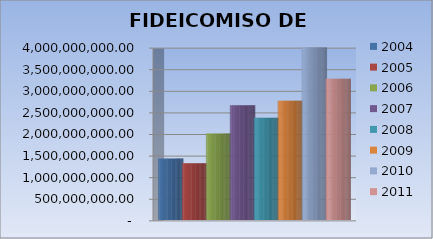
| Category | 2004 | 2005 | 2006 | 2007 | 2008 | 2009 | 2010 | 2011 |
|---|---|---|---|---|---|---|---|---|
| 0 | 1422260632.71 | 1313515937.59 | 2001466460.07 | 2656443950.5 | 2367075847.54 | 2762175941.87 | 3997088371.31 | 3272152597.75 |